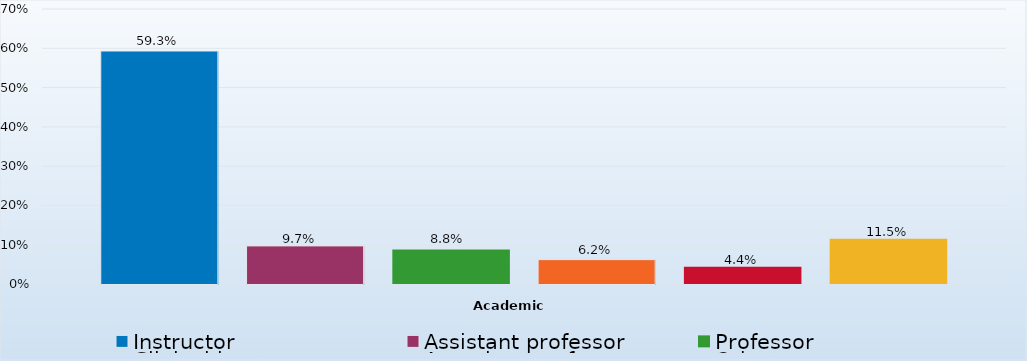
| Category | Instructor | Assistant professor | Professor | Clinical instructor | Associate professor | Other |
|---|---|---|---|---|---|---|
| 0 | 0.593 | 0.097 | 0.088 | 0.062 | 0.044 | 0.115 |